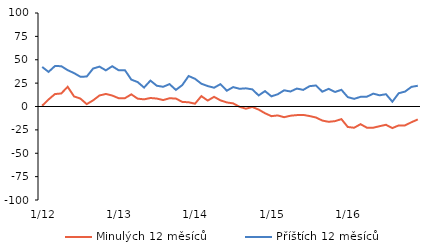
| Category | Minulých 12 měsíců | Příštích 12 měsíců |
|---|---|---|
|  1/12 | 0.85 | 42.3 |
|  2/12 | 7.49 | 37.02 |
|  3/12 | 13.29 | 43.26 |
|  4/12 | 13.96 | 43.14 |
|  5/12 | 21.08 | 38.87 |
|  6/12 | 10.81 | 35.74 |
|  7/12 | 8.46 | 31.81 |
|  8/12 | 2.55 | 32.03 |
|  9/12 | 6.58 | 40.6 |
|  10/12 | 11.79 | 42.65 |
|  11/12 | 13.41 | 38.66 |
|  12/12 | 11.71 | 43.07 |
|  1/13 | 8.92 | 38.82 |
|  2/13 | 8.92 | 38.82 |
|  3/13 | 12.98 | 28.75 |
|  4/13 | 8.4 | 26.12 |
|  5/13 | 7.64 | 20.26 |
|  6/13 | 9.1 | 27.71 |
|  7/13 | 8.51 | 22.2 |
|  8/13 | 6.89 | 21.06 |
|  9/13 | 8.81 | 23.95 |
|  10/13 | 8.54 | 17.76 |
|  11/13 | 4.88 | 22.87 |
|  12/13 | 4.53 | 32.62 |
|  1/14 | 2.99 | 29.64 |
|  2/14 | 11.1 | 24.37 |
|  3/14 | 6.35 | 21.86 |
|  4/14 | 10.34 | 20.09 |
|  5/14 | 6.57 | 23.91 |
|  6/14 | 4.33 | 16.91 |
|  7/14 | 3.35 | 20.75 |
|  8/14 | -0.33 | 18.95 |
|  9/14 | -2.37 | 19.44 |
|  10/14 | -0.5 | 18.32 |
|  11/14 | -3.3 | 11.85 |
|  12/14 | -7.21 | 16.46 |
|  1/15 | -10.32 | 10.88 |
|  2/15 | -9.55 | 13.1 |
|  3/15 | -11.45 | 17.32 |
|  4/15 | -9.85 | 16.04 |
|  5/15 | -9.22 | 19.19 |
|  6/15 | -8.99 | 17.77 |
|  7/15 | -10.2 | 21.74 |
|  8/15 | -11.76 | 22.49 |
|  9/15 | -15.03 | 15.86 |
|  10/15 | -16.38 | 18.89 |
|  11/15 | -15.64 | 15.55 |
|  12/15 | -13.49 | 17.84 |
|  1/16 | -21.91 | 10.03 |
|  2/16 | -22.72 | 8.16 |
|  3/16 | -18.91 | 10.34 |
|  4/16 | -22.65 | 10.48 |
|  5/16 | -22.69 | 13.73 |
|  6/16 | -21.05 | 11.99 |
|  7/16 | -19.56 | 13.15 |
|  8/16 | -23.1 | 5.15 |
|  9/16 | -20.21 | 14.17 |
|  10/16 | -20.19 | 16 |
|  11/16 | -16.81 | 20.99 |
|  12/16 | -13.84 | 22.19 |